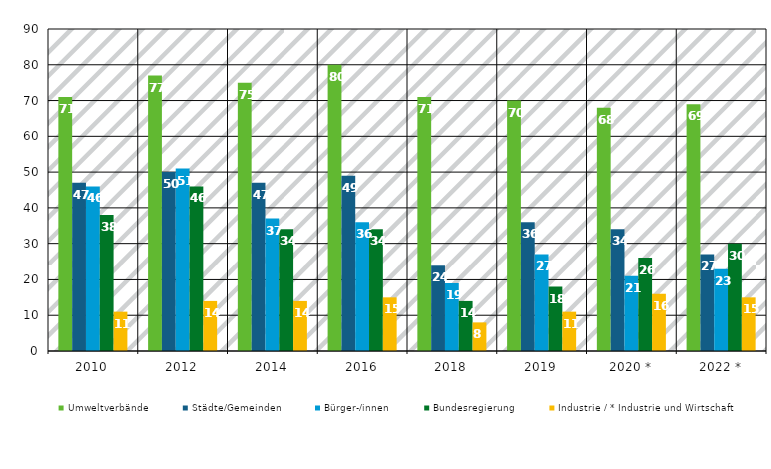
| Category | Umweltverbände | Städte/Gemeinden | Bürger-/innen | Bundesregierung | Industrie / * Industrie und Wirtschaft |
|---|---|---|---|---|---|
| 2010 | 71 | 47 | 46 | 38 | 11 |
| 2012 | 77 | 50 | 51 | 46 | 14 |
| 2014 | 75 | 47 | 37 | 34 | 14 |
| 2016 | 80 | 49 | 36 | 34 | 15 |
| 2018 | 71 | 24 | 19 | 14 | 8 |
| 2019 | 70 | 36 | 27 | 18 | 11 |
| 2020 * | 68 | 34 | 21 | 26 | 16 |
| 2022 * | 69 | 27 | 23 | 30 | 15 |